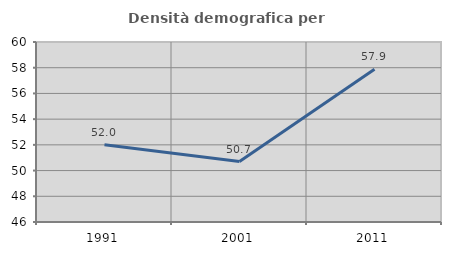
| Category | Densità demografica |
|---|---|
| 1991.0 | 52.003 |
| 2001.0 | 50.697 |
| 2011.0 | 57.881 |